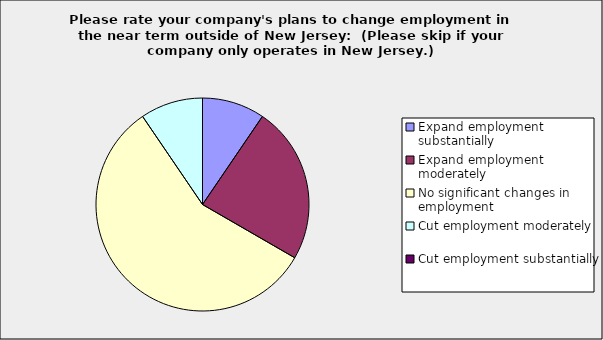
| Category | Series 0 |
|---|---|
| Expand employment substantially | 0.095 |
| Expand employment moderately | 0.238 |
| No significant changes in employment | 0.571 |
| Cut employment moderately | 0.095 |
| Cut employment substantially | 0 |